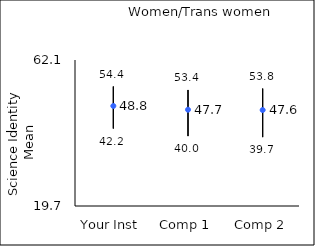
| Category | 25th percentile | 75th percentile | Mean |
|---|---|---|---|
| Your Inst | 42.2 | 54.4 | 48.75 |
| Comp 1 | 40 | 53.4 | 47.66 |
| Comp 2 | 39.7 | 53.8 | 47.57 |